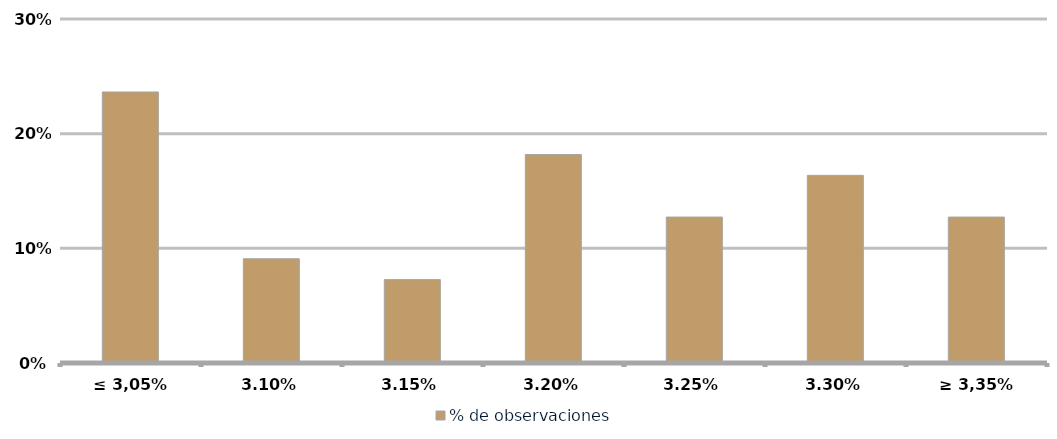
| Category | % de observaciones  |
|---|---|
| ≤ 3,05% | 0.236 |
| 3,10% | 0.091 |
| 3,15% | 0.073 |
| 3,20% | 0.182 |
| 3,25% | 0.127 |
| 3,30% | 0.164 |
| ≥ 3,35% | 0.127 |